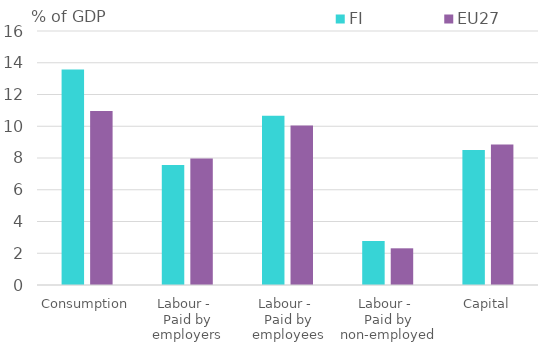
| Category | FI | EU27 |
|---|---|---|
| Consumption | 13.572 | 10.967 |
| Labour - 
Paid by employers | 7.557 | 7.966 |
| Labour - 
Paid by employees | 10.662 | 10.052 |
| Labour - 
Paid by non-employed | 2.772 | 2.311 |
| Capital | 8.496 | 8.858 |